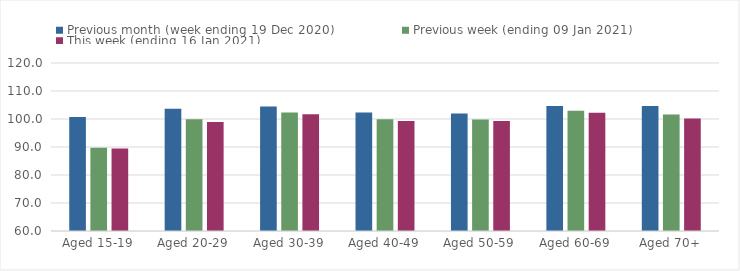
| Category | Previous month (week ending 19 Dec 2020) | Previous week (ending 09 Jan 2021) | This week (ending 16 Jan 2021) |
|---|---|---|---|
| Aged 15-19 | 100.67 | 89.74 | 89.44 |
| Aged 20-29 | 103.65 | 99.89 | 98.92 |
| Aged 30-39 | 104.45 | 102.32 | 101.68 |
| Aged 40-49 | 102.34 | 99.9 | 99.26 |
| Aged 50-59 | 101.98 | 99.86 | 99.31 |
| Aged 60-69 | 104.68 | 102.98 | 102.23 |
| Aged 70+ | 104.64 | 101.59 | 100.2 |